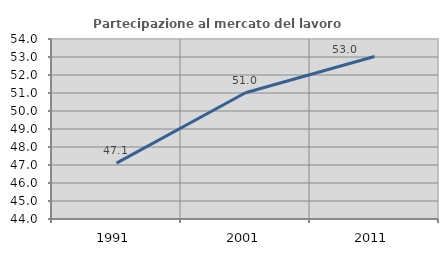
| Category | Partecipazione al mercato del lavoro  femminile |
|---|---|
| 1991.0 | 47.106 |
| 2001.0 | 51.013 |
| 2011.0 | 53.025 |